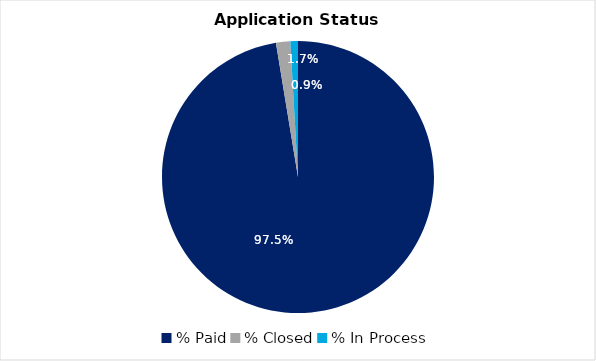
| Category | Series 0 |
|---|---|
| % Paid | 0.975 |
| % Closed | 0.017 |
| % In Process | 0.009 |